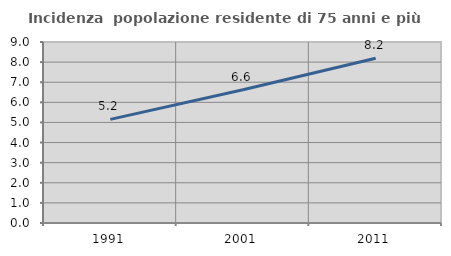
| Category | Incidenza  popolazione residente di 75 anni e più |
|---|---|
| 1991.0 | 5.153 |
| 2001.0 | 6.627 |
| 2011.0 | 8.194 |